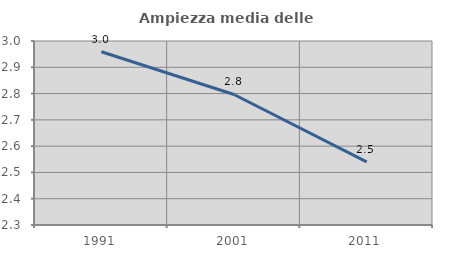
| Category | Ampiezza media delle famiglie |
|---|---|
| 1991.0 | 2.959 |
| 2001.0 | 2.797 |
| 2011.0 | 2.54 |